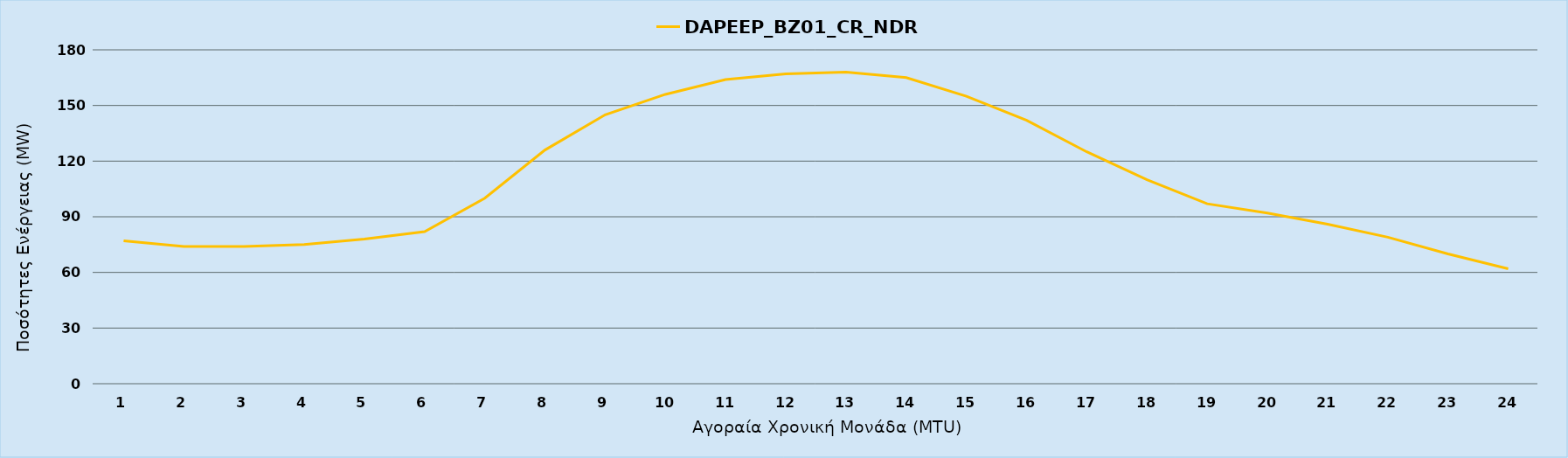
| Category | DAPEEP_BZ01_CR_NDR |
|---|---|
| 0 | 77 |
| 1 | 74 |
| 2 | 74 |
| 3 | 75 |
| 4 | 78 |
| 5 | 82 |
| 6 | 100 |
| 7 | 126 |
| 8 | 145 |
| 9 | 156 |
| 10 | 164 |
| 11 | 167 |
| 12 | 168 |
| 13 | 165 |
| 14 | 155 |
| 15 | 142 |
| 16 | 125 |
| 17 | 110 |
| 18 | 97 |
| 19 | 92 |
| 20 | 86 |
| 21 | 79 |
| 22 | 70 |
| 23 | 62 |